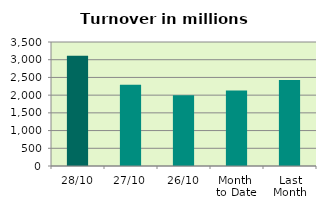
| Category | Series 0 |
|---|---|
| 28/10 | 3114.714 |
| 27/10 | 2295.053 |
| 26/10 | 2000.334 |
| Month 
to Date | 2131.01 |
| Last
Month | 2424.403 |